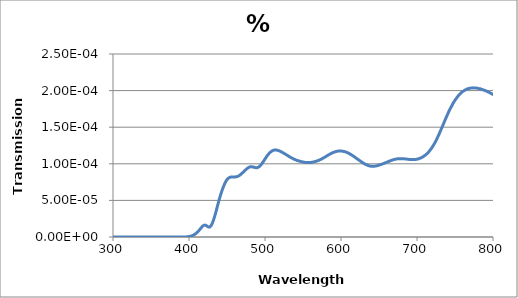
| Category | % Transmission |
|---|---|
| 200.0 | 0 |
| 201.0 | 0 |
| 202.0 | 0 |
| 203.0 | 0 |
| 204.0 | 0 |
| 205.0 | 0 |
| 206.0 | 0 |
| 207.0 | 0 |
| 208.0 | 0 |
| 209.0 | 0 |
| 210.0 | 0 |
| 211.0 | 0 |
| 212.0 | 0 |
| 213.0 | 0 |
| 214.0 | 0 |
| 215.0 | 0 |
| 216.0 | 0 |
| 217.0 | 0 |
| 218.0 | 0 |
| 219.0 | 0 |
| 220.0 | 0 |
| 221.0 | 0 |
| 222.0 | 0 |
| 223.0 | 0 |
| 224.0 | 0 |
| 225.0 | 0 |
| 226.0 | 0 |
| 227.0 | 0 |
| 228.0 | 0 |
| 229.0 | 0 |
| 230.0 | 0 |
| 231.0 | 0 |
| 232.0 | 0 |
| 233.0 | 0 |
| 234.0 | 0 |
| 235.0 | 0 |
| 236.0 | 0 |
| 237.0 | 0 |
| 238.0 | 0 |
| 239.0 | 0 |
| 240.0 | 0 |
| 241.0 | 0 |
| 242.0 | 0 |
| 243.0 | 0 |
| 244.0 | 0 |
| 245.0 | 0 |
| 246.0 | 0 |
| 247.0 | 0 |
| 248.0 | 0 |
| 249.0 | 0 |
| 250.0 | 0 |
| 251.0 | 0 |
| 252.0 | 0 |
| 253.0 | 0 |
| 254.0 | 0 |
| 255.0 | 0 |
| 256.0 | 0 |
| 257.0 | 0 |
| 258.0 | 0 |
| 259.0 | 0 |
| 260.0 | 0 |
| 261.0 | 0 |
| 262.0 | 0 |
| 263.0 | 0 |
| 264.0 | 0 |
| 265.0 | 0 |
| 266.0 | 0 |
| 267.0 | 0 |
| 268.0 | 0 |
| 269.0 | 0 |
| 270.0 | 0 |
| 271.0 | 0 |
| 272.0 | 0 |
| 273.0 | 0 |
| 274.0 | 0 |
| 275.0 | 0 |
| 276.0 | 0 |
| 277.0 | 0 |
| 278.0 | 0 |
| 279.0 | 0 |
| 280.0 | 0 |
| 281.0 | 0 |
| 282.0 | 0 |
| 283.0 | 0 |
| 284.0 | 0 |
| 285.0 | 0 |
| 286.0 | 0 |
| 287.0 | 0 |
| 288.0 | 0 |
| 289.0 | 0 |
| 290.0 | 0 |
| 291.0 | 0 |
| 292.0 | 0 |
| 293.0 | 0 |
| 294.0 | 0 |
| 295.0 | 0 |
| 296.0 | 0 |
| 297.0 | 0 |
| 298.0 | 0 |
| 299.0 | 0 |
| 300.0 | 0 |
| 301.0 | 0 |
| 302.0 | 0 |
| 303.0 | 0 |
| 304.0 | 0 |
| 305.0 | 0 |
| 306.0 | 0 |
| 307.0 | 0 |
| 308.0 | 0 |
| 309.0 | 0 |
| 310.0 | 0 |
| 311.0 | 0 |
| 312.0 | 0 |
| 313.0 | 0 |
| 314.0 | 0 |
| 315.0 | 0 |
| 316.0 | 0 |
| 317.0 | 0 |
| 318.0 | 0 |
| 319.0 | 0 |
| 320.0 | 0 |
| 321.0 | 0 |
| 322.0 | 0 |
| 323.0 | 0 |
| 324.0 | 0 |
| 325.0 | 0 |
| 326.0 | 0 |
| 327.0 | 0 |
| 328.0 | 0 |
| 329.0 | 0 |
| 330.0 | 0 |
| 331.0 | 0 |
| 332.0 | 0 |
| 333.0 | 0 |
| 334.0 | 0 |
| 335.0 | 0 |
| 336.0 | 0 |
| 337.0 | 0 |
| 338.0 | 0 |
| 339.0 | 0 |
| 340.0 | 0 |
| 341.0 | 0 |
| 342.0 | 0 |
| 343.0 | 0 |
| 344.0 | 0 |
| 345.0 | 0 |
| 346.0 | 0 |
| 347.0 | 0 |
| 348.0 | 0 |
| 349.0 | 0 |
| 350.0 | 0 |
| 351.0 | 0 |
| 352.0 | 0 |
| 353.0 | 0 |
| 354.0 | 0 |
| 355.0 | 0 |
| 356.0 | 0 |
| 357.0 | 0 |
| 358.0 | 0 |
| 359.0 | 0 |
| 360.0 | 0 |
| 361.0 | 0 |
| 362.0 | 0 |
| 363.0 | 0 |
| 364.0 | 0 |
| 365.0 | 0 |
| 366.0 | 0 |
| 367.0 | 0 |
| 368.0 | 0 |
| 369.0 | 0 |
| 370.0 | 0 |
| 371.0 | 0 |
| 372.0 | 0 |
| 373.0 | 0 |
| 374.0 | 0 |
| 375.0 | 0 |
| 376.0 | 0 |
| 377.0 | 0 |
| 378.0 | 0 |
| 379.0 | 0 |
| 380.0 | 0 |
| 381.0 | 0 |
| 382.0 | 0 |
| 383.0 | 0 |
| 384.0 | 0 |
| 385.0 | 0 |
| 386.0 | 0 |
| 387.0 | 0 |
| 388.0 | 0 |
| 389.0 | 0 |
| 390.0 | 0 |
| 391.0 | 0 |
| 392.0 | 0 |
| 393.0 | 0 |
| 394.0 | 0 |
| 395.0 | 0 |
| 396.0 | 0 |
| 397.0 | 0 |
| 398.0 | 0 |
| 399.0 | 0 |
| 400.0 | 0 |
| 401.0 | 0 |
| 402.0 | 0 |
| 403.0 | 0 |
| 404.0 | 0 |
| 405.0 | 0 |
| 406.0 | 0 |
| 407.0 | 0 |
| 408.0 | 0 |
| 409.0 | 0 |
| 410.0 | 0 |
| 411.0 | 0 |
| 412.0 | 0 |
| 413.0 | 0 |
| 414.0 | 0 |
| 415.0 | 0 |
| 416.0 | 0 |
| 417.0 | 0 |
| 418.0 | 0 |
| 419.0 | 0 |
| 420.0 | 0 |
| 421.0 | 0 |
| 422.0 | 0 |
| 423.0 | 0 |
| 424.0 | 0 |
| 425.0 | 0 |
| 426.0 | 0 |
| 427.0 | 0 |
| 428.0 | 0 |
| 429.0 | 0 |
| 430.0 | 0 |
| 431.0 | 0 |
| 432.0 | 0 |
| 433.0 | 0 |
| 434.0 | 0 |
| 435.0 | 0 |
| 436.0 | 0 |
| 437.0 | 0 |
| 438.0 | 0 |
| 439.0 | 0 |
| 440.0 | 0 |
| 441.0 | 0 |
| 442.0 | 0 |
| 443.0 | 0 |
| 444.0 | 0 |
| 445.0 | 0 |
| 446.0 | 0 |
| 447.0 | 0 |
| 448.0 | 0 |
| 449.0 | 0 |
| 450.0 | 0 |
| 451.0 | 0 |
| 452.0 | 0 |
| 453.0 | 0 |
| 454.0 | 0 |
| 455.0 | 0 |
| 456.0 | 0 |
| 457.0 | 0 |
| 458.0 | 0 |
| 459.0 | 0 |
| 460.0 | 0 |
| 461.0 | 0 |
| 462.0 | 0 |
| 463.0 | 0 |
| 464.0 | 0 |
| 465.0 | 0 |
| 466.0 | 0 |
| 467.0 | 0 |
| 468.0 | 0 |
| 469.0 | 0 |
| 470.0 | 0 |
| 471.0 | 0 |
| 472.0 | 0 |
| 473.0 | 0 |
| 474.0 | 0 |
| 475.0 | 0 |
| 476.0 | 0 |
| 477.0 | 0 |
| 478.0 | 0 |
| 479.0 | 0 |
| 480.0 | 0 |
| 481.0 | 0 |
| 482.0 | 0 |
| 483.0 | 0 |
| 484.0 | 0 |
| 485.0 | 0 |
| 486.0 | 0 |
| 487.0 | 0 |
| 488.0 | 0 |
| 489.0 | 0 |
| 490.0 | 0 |
| 491.0 | 0 |
| 492.0 | 0 |
| 493.0 | 0 |
| 494.0 | 0 |
| 495.0 | 0 |
| 496.0 | 0 |
| 497.0 | 0 |
| 498.0 | 0 |
| 499.0 | 0 |
| 500.0 | 0 |
| 501.0 | 0 |
| 502.0 | 0 |
| 503.0 | 0 |
| 504.0 | 0 |
| 505.0 | 0 |
| 506.0 | 0 |
| 507.0 | 0 |
| 508.0 | 0 |
| 509.0 | 0 |
| 510.0 | 0 |
| 511.0 | 0 |
| 512.0 | 0 |
| 513.0 | 0 |
| 514.0 | 0 |
| 515.0 | 0 |
| 516.0 | 0 |
| 517.0 | 0 |
| 518.0 | 0 |
| 519.0 | 0 |
| 520.0 | 0 |
| 521.0 | 0 |
| 522.0 | 0 |
| 523.0 | 0 |
| 524.0 | 0 |
| 525.0 | 0 |
| 526.0 | 0 |
| 527.0 | 0 |
| 528.0 | 0 |
| 529.0 | 0 |
| 530.0 | 0 |
| 531.0 | 0 |
| 532.0 | 0 |
| 533.0 | 0 |
| 534.0 | 0 |
| 535.0 | 0 |
| 536.0 | 0 |
| 537.0 | 0 |
| 538.0 | 0 |
| 539.0 | 0 |
| 540.0 | 0 |
| 541.0 | 0 |
| 542.0 | 0 |
| 543.0 | 0 |
| 544.0 | 0 |
| 545.0 | 0 |
| 546.0 | 0 |
| 547.0 | 0 |
| 548.0 | 0 |
| 549.0 | 0 |
| 550.0 | 0 |
| 551.0 | 0 |
| 552.0 | 0 |
| 553.0 | 0 |
| 554.0 | 0 |
| 555.0 | 0 |
| 556.0 | 0 |
| 557.0 | 0 |
| 558.0 | 0 |
| 559.0 | 0 |
| 560.0 | 0 |
| 561.0 | 0 |
| 562.0 | 0 |
| 563.0 | 0 |
| 564.0 | 0 |
| 565.0 | 0 |
| 566.0 | 0 |
| 567.0 | 0 |
| 568.0 | 0 |
| 569.0 | 0 |
| 570.0 | 0 |
| 571.0 | 0 |
| 572.0 | 0 |
| 573.0 | 0 |
| 574.0 | 0 |
| 575.0 | 0 |
| 576.0 | 0 |
| 577.0 | 0 |
| 578.0 | 0 |
| 579.0 | 0 |
| 580.0 | 0 |
| 581.0 | 0 |
| 582.0 | 0 |
| 583.0 | 0 |
| 584.0 | 0 |
| 585.0 | 0 |
| 586.0 | 0 |
| 587.0 | 0 |
| 588.0 | 0 |
| 589.0 | 0 |
| 590.0 | 0 |
| 591.0 | 0 |
| 592.0 | 0 |
| 593.0 | 0 |
| 594.0 | 0 |
| 595.0 | 0 |
| 596.0 | 0 |
| 597.0 | 0 |
| 598.0 | 0 |
| 599.0 | 0 |
| 600.0 | 0 |
| 601.0 | 0 |
| 602.0 | 0 |
| 603.0 | 0 |
| 604.0 | 0 |
| 605.0 | 0 |
| 606.0 | 0 |
| 607.0 | 0 |
| 608.0 | 0 |
| 609.0 | 0 |
| 610.0 | 0 |
| 611.0 | 0 |
| 612.0 | 0 |
| 613.0 | 0 |
| 614.0 | 0 |
| 615.0 | 0 |
| 616.0 | 0 |
| 617.0 | 0 |
| 618.0 | 0 |
| 619.0 | 0 |
| 620.0 | 0 |
| 621.0 | 0 |
| 622.0 | 0 |
| 623.0 | 0 |
| 624.0 | 0 |
| 625.0 | 0 |
| 626.0 | 0 |
| 627.0 | 0 |
| 628.0 | 0 |
| 629.0 | 0 |
| 630.0 | 0 |
| 631.0 | 0 |
| 632.0 | 0 |
| 633.0 | 0 |
| 634.0 | 0 |
| 635.0 | 0 |
| 636.0 | 0 |
| 637.0 | 0 |
| 638.0 | 0 |
| 639.0 | 0 |
| 640.0 | 0 |
| 641.0 | 0 |
| 642.0 | 0 |
| 643.0 | 0 |
| 644.0 | 0 |
| 645.0 | 0 |
| 646.0 | 0 |
| 647.0 | 0 |
| 648.0 | 0 |
| 649.0 | 0 |
| 650.0 | 0 |
| 651.0 | 0 |
| 652.0 | 0 |
| 653.0 | 0 |
| 654.0 | 0 |
| 655.0 | 0 |
| 656.0 | 0 |
| 657.0 | 0 |
| 658.0 | 0 |
| 659.0 | 0 |
| 660.0 | 0 |
| 661.0 | 0 |
| 662.0 | 0 |
| 663.0 | 0 |
| 664.0 | 0 |
| 665.0 | 0 |
| 666.0 | 0 |
| 667.0 | 0 |
| 668.0 | 0 |
| 669.0 | 0 |
| 670.0 | 0 |
| 671.0 | 0 |
| 672.0 | 0 |
| 673.0 | 0 |
| 674.0 | 0 |
| 675.0 | 0 |
| 676.0 | 0 |
| 677.0 | 0 |
| 678.0 | 0 |
| 679.0 | 0 |
| 680.0 | 0 |
| 681.0 | 0 |
| 682.0 | 0 |
| 683.0 | 0 |
| 684.0 | 0 |
| 685.0 | 0 |
| 686.0 | 0 |
| 687.0 | 0 |
| 688.0 | 0 |
| 689.0 | 0 |
| 690.0 | 0 |
| 691.0 | 0 |
| 692.0 | 0 |
| 693.0 | 0 |
| 694.0 | 0 |
| 695.0 | 0 |
| 696.0 | 0 |
| 697.0 | 0 |
| 698.0 | 0 |
| 699.0 | 0 |
| 700.0 | 0 |
| 701.0 | 0 |
| 702.0 | 0 |
| 703.0 | 0 |
| 704.0 | 0 |
| 705.0 | 0 |
| 706.0 | 0 |
| 707.0 | 0 |
| 708.0 | 0 |
| 709.0 | 0 |
| 710.0 | 0 |
| 711.0 | 0 |
| 712.0 | 0 |
| 713.0 | 0 |
| 714.0 | 0 |
| 715.0 | 0 |
| 716.0 | 0 |
| 717.0 | 0 |
| 718.0 | 0 |
| 719.0 | 0 |
| 720.0 | 0 |
| 721.0 | 0 |
| 722.0 | 0 |
| 723.0 | 0 |
| 724.0 | 0 |
| 725.0 | 0 |
| 726.0 | 0 |
| 727.0 | 0 |
| 728.0 | 0 |
| 729.0 | 0 |
| 730.0 | 0 |
| 731.0 | 0 |
| 732.0 | 0 |
| 733.0 | 0 |
| 734.0 | 0 |
| 735.0 | 0 |
| 736.0 | 0 |
| 737.0 | 0 |
| 738.0 | 0 |
| 739.0 | 0 |
| 740.0 | 0 |
| 741.0 | 0 |
| 742.0 | 0 |
| 743.0 | 0 |
| 744.0 | 0 |
| 745.0 | 0 |
| 746.0 | 0 |
| 747.0 | 0 |
| 748.0 | 0 |
| 749.0 | 0 |
| 750.0 | 0 |
| 751.0 | 0 |
| 752.0 | 0 |
| 753.0 | 0 |
| 754.0 | 0 |
| 755.0 | 0 |
| 756.0 | 0 |
| 757.0 | 0 |
| 758.0 | 0 |
| 759.0 | 0 |
| 760.0 | 0 |
| 761.0 | 0 |
| 762.0 | 0 |
| 763.0 | 0 |
| 764.0 | 0 |
| 765.0 | 0 |
| 766.0 | 0 |
| 767.0 | 0 |
| 768.0 | 0 |
| 769.0 | 0 |
| 770.0 | 0 |
| 771.0 | 0 |
| 772.0 | 0 |
| 773.0 | 0 |
| 774.0 | 0 |
| 775.0 | 0 |
| 776.0 | 0 |
| 777.0 | 0 |
| 778.0 | 0 |
| 779.0 | 0 |
| 780.0 | 0 |
| 781.0 | 0 |
| 782.0 | 0 |
| 783.0 | 0 |
| 784.0 | 0 |
| 785.0 | 0 |
| 786.0 | 0 |
| 787.0 | 0 |
| 788.0 | 0 |
| 789.0 | 0 |
| 790.0 | 0 |
| 791.0 | 0 |
| 792.0 | 0 |
| 793.0 | 0 |
| 794.0 | 0 |
| 795.0 | 0 |
| 796.0 | 0 |
| 797.0 | 0 |
| 798.0 | 0 |
| 799.0 | 0 |
| 800.0 | 0 |
| 801.0 | 0 |
| 802.0 | 0 |
| 803.0 | 0 |
| 804.0 | 0 |
| 805.0 | 0 |
| 806.0 | 0 |
| 807.0 | 0 |
| 808.0 | 0 |
| 809.0 | 0 |
| 810.0 | 0 |
| 811.0 | 0 |
| 812.0 | 0 |
| 813.0 | 0 |
| 814.0 | 0 |
| 815.0 | 0 |
| 816.0 | 0 |
| 817.0 | 0 |
| 818.0 | 0 |
| 819.0 | 0 |
| 820.0 | 0 |
| 821.0 | 0 |
| 822.0 | 0 |
| 823.0 | 0 |
| 824.0 | 0 |
| 825.0 | 0 |
| 826.0 | 0 |
| 827.0 | 0 |
| 828.0 | 0 |
| 829.0 | 0 |
| 830.0 | 0 |
| 831.0 | 0 |
| 832.0 | 0 |
| 833.0 | 0 |
| 834.0 | 0 |
| 835.0 | 0 |
| 836.0 | 0 |
| 837.0 | 0 |
| 838.0 | 0 |
| 839.0 | 0 |
| 840.0 | 0 |
| 841.0 | 0 |
| 842.0 | 0 |
| 843.0 | 0 |
| 844.0 | 0 |
| 845.0 | 0 |
| 846.0 | 0 |
| 847.0 | 0 |
| 848.0 | 0 |
| 849.0 | 0 |
| 850.0 | 0 |